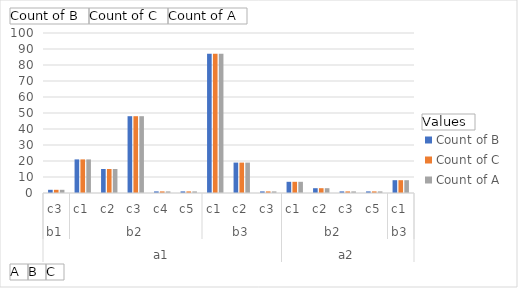
| Category | Count of B | Count of C | Count of A |
|---|---|---|---|
| 0 | 2 | 2 | 2 |
| 1 | 21 | 21 | 21 |
| 2 | 15 | 15 | 15 |
| 3 | 48 | 48 | 48 |
| 4 | 1 | 1 | 1 |
| 5 | 1 | 1 | 1 |
| 6 | 87 | 87 | 87 |
| 7 | 19 | 19 | 19 |
| 8 | 1 | 1 | 1 |
| 9 | 7 | 7 | 7 |
| 10 | 3 | 3 | 3 |
| 11 | 1 | 1 | 1 |
| 12 | 1 | 1 | 1 |
| 13 | 8 | 8 | 8 |